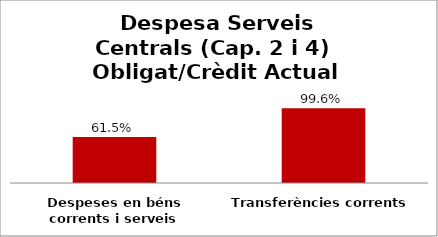
| Category | Series 0 |
|---|---|
| Despeses en béns corrents i serveis | 0.615 |
| Transferències corrents | 0.996 |